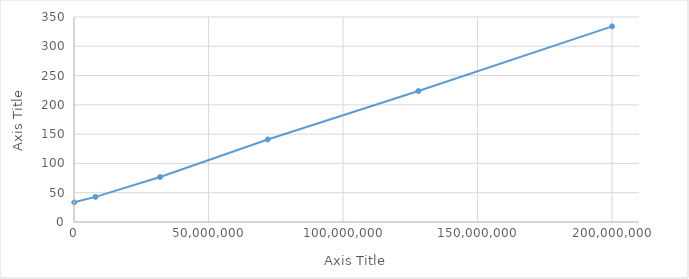
| Category | Series 0 |
|---|---|
| 80000.0 | 33.555 |
| 8000000.0 | 42.904 |
| 32000000.0 | 76.896 |
| 72000000.0 | 140.887 |
| 128000000.0 | 223.543 |
| 200000000.0 | 333.94 |